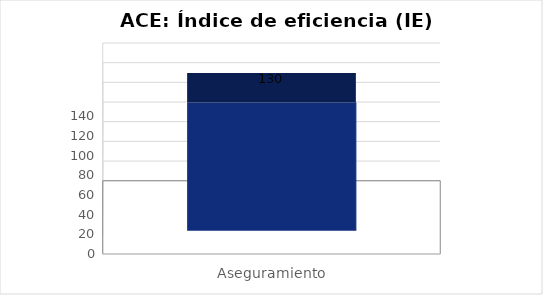
| Category | Índice de eficiencia (IE)  |
|---|---|
| Aseguramiento | 130.334 |